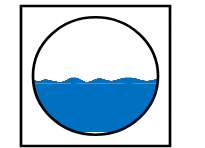
| Category | Series 0 | Series 1 | Series 2 |
|---|---|---|---|
| 0 | 0.42 | 0.05 | 0.53 |